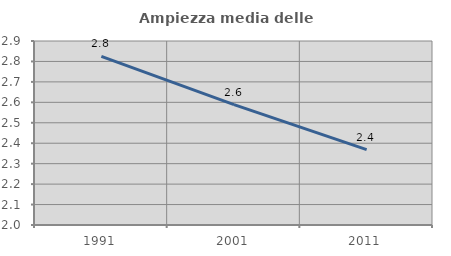
| Category | Ampiezza media delle famiglie |
|---|---|
| 1991.0 | 2.824 |
| 2001.0 | 2.588 |
| 2011.0 | 2.369 |